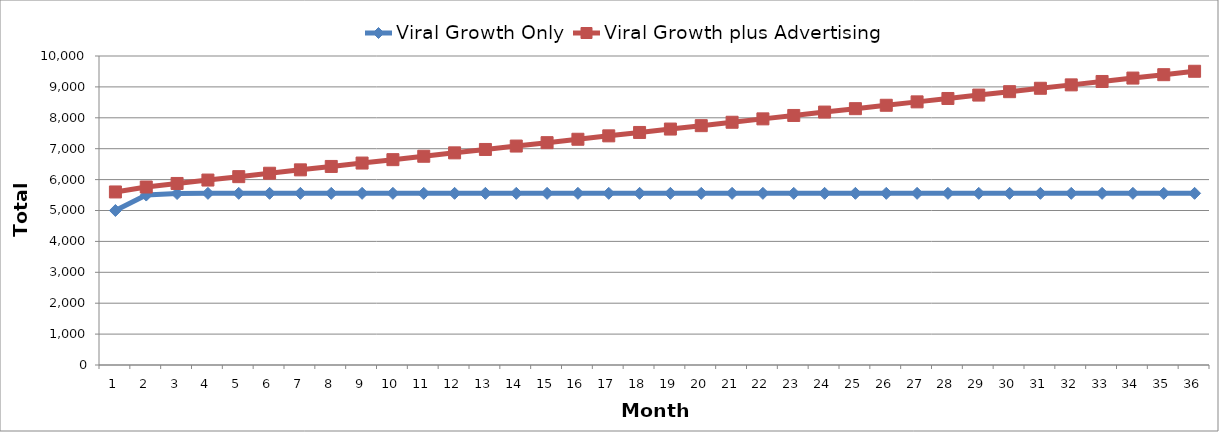
| Category | Viral Growth Only | Viral Growth plus Advertising |
|---|---|---|
| 1 | 5000 | 5600 |
| 2 | 5500 | 5760 |
| 3 | 5550 | 5875 |
| 4 | 5555 | 5985.5 |
| 5 | 5555.5 | 6095.55 |
| 6 | 5555.55 | 6205.555 |
| 7 | 5555.555 | 6315.556 |
| 8 | 5555.556 | 6425.556 |
| 9 | 5555.556 | 6535.556 |
| 10 | 5555.556 | 6645.556 |
| 11 | 5555.556 | 6755.556 |
| 12 | 5555.556 | 6865.556 |
| 13 | 5555.556 | 6975.556 |
| 14 | 5555.556 | 7085.556 |
| 15 | 5555.556 | 7195.556 |
| 16 | 5555.556 | 7305.556 |
| 17 | 5555.556 | 7415.556 |
| 18 | 5555.556 | 7525.556 |
| 19 | 5555.556 | 7635.556 |
| 20 | 5555.556 | 7745.556 |
| 21 | 5555.556 | 7855.556 |
| 22 | 5555.556 | 7965.556 |
| 23 | 5555.556 | 8075.556 |
| 24 | 5555.556 | 8185.556 |
| 25 | 5555.556 | 8295.556 |
| 26 | 5555.556 | 8405.556 |
| 27 | 5555.556 | 8515.556 |
| 28 | 5555.556 | 8625.556 |
| 29 | 5555.556 | 8735.556 |
| 30 | 5555.556 | 8845.556 |
| 31 | 5555.556 | 8955.556 |
| 32 | 5555.556 | 9065.556 |
| 33 | 5555.556 | 9175.556 |
| 34 | 5555.556 | 9285.556 |
| 35 | 5555.556 | 9395.556 |
| 36 | 5555.556 | 9505.556 |